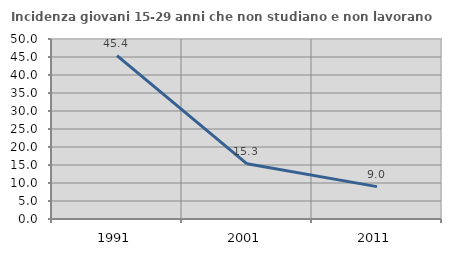
| Category | Incidenza giovani 15-29 anni che non studiano e non lavorano  |
|---|---|
| 1991.0 | 45.395 |
| 2001.0 | 15.328 |
| 2011.0 | 8.989 |